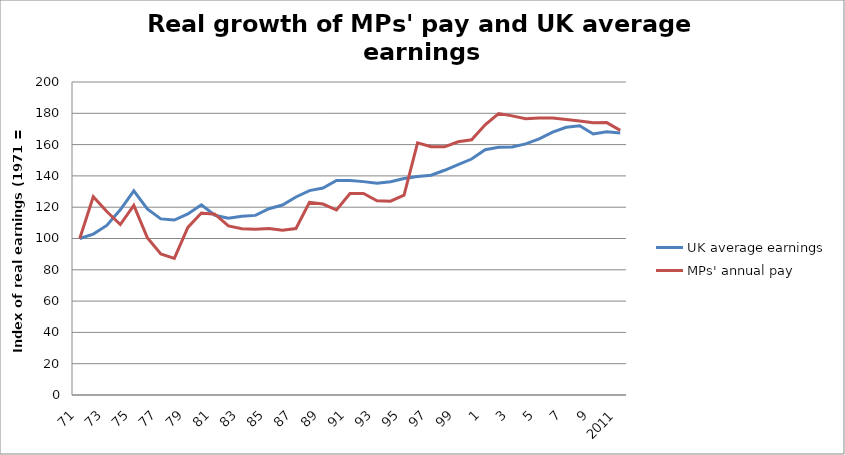
| Category | UK average earnings | MPs' annual pay |
|---|---|---|
| 71.0 | 100 | 100 |
| 72.0 | 102.838 | 126.713 |
| 73.0 | 108.369 | 117.217 |
| 74.0 | 118.366 | 108.922 |
| 75.0 | 130.49 | 121.152 |
| 76.0 | 118.839 | 100.525 |
| 77.0 | 112.529 | 90.188 |
| 78.0 | 111.81 | 87.264 |
| 79.0 | 115.681 | 107.124 |
| 80.0 | 121.488 | 116.261 |
| 81.0 | 114.824 | 115.528 |
| 82.0 | 112.945 | 108.007 |
| 83.0 | 114.158 | 106.202 |
| 84.0 | 114.777 | 105.989 |
| 85.0 | 119.024 | 106.371 |
| 86.0 | 121.386 | 105.268 |
| 87.0 | 126.528 | 106.376 |
| 88.0 | 130.625 | 123.071 |
| 89.0 | 132.228 | 122.03 |
| 90.0 | 137.129 | 118.197 |
| 91.0 | 137.089 | 128.68 |
| 92.0 | 136.34 | 128.734 |
| 93.0 | 135.303 | 124.07 |
| 94.0 | 136.307 | 123.857 |
| 95.0 | 138.365 | 127.707 |
| 96.0 | 139.569 | 161.143 |
| 97.0 | 140.462 | 158.625 |
| 98.0 | 143.604 | 158.565 |
| 99.0 | 147.256 | 161.812 |
| 2000.0 | 150.789 | 163.08 |
| 1.0 | 156.751 | 172.668 |
| 2.0 | 158.339 | 179.828 |
| 3.0 | 158.477 | 178.351 |
| 4.0 | 160.443 | 176.495 |
| 5.0 | 163.654 | 176.976 |
| 6.0 | 167.927 | 176.923 |
| 7.0 | 171.062 | 176.079 |
| 8.0 | 172.086 | 175.03 |
| 9.0 | 166.808 | 173.948 |
| 10.0 | 168.218 | 174.044 |
| 2011.0 | 167.396 | 169.078 |